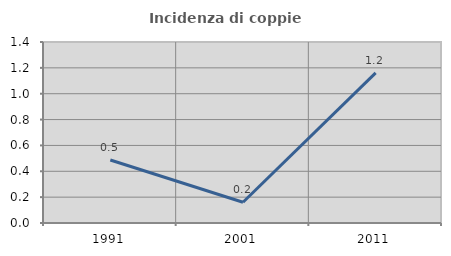
| Category | Incidenza di coppie miste |
|---|---|
| 1991.0 | 0.487 |
| 2001.0 | 0.161 |
| 2011.0 | 1.161 |